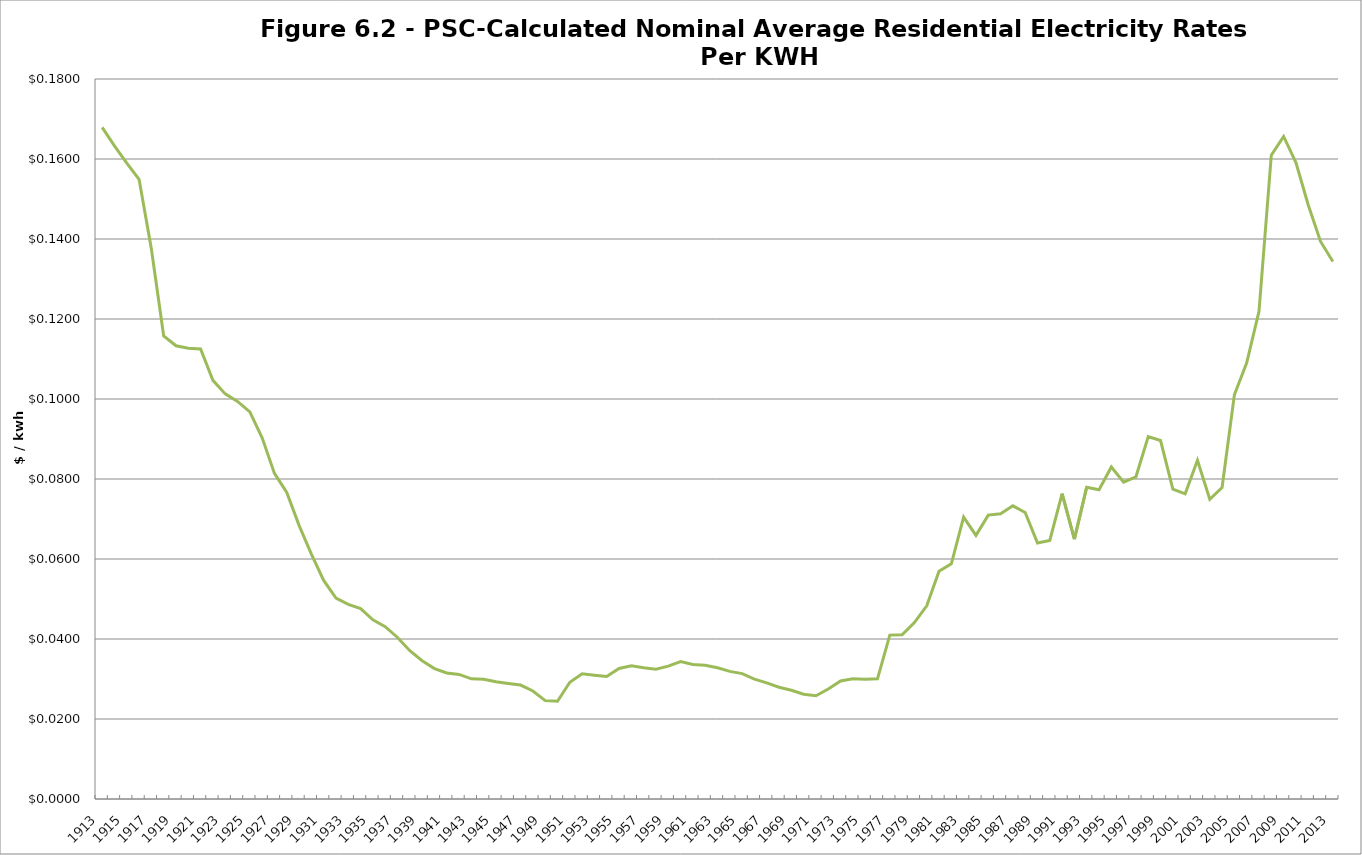
| Category |  Nominal Rates per kwh |
|---|---|
| 1913.0 | 0.168 |
| 1914.0 | 0.163 |
| 1915.0 | 0.159 |
| 1916.0 | 0.155 |
| 1917.0 | 0.138 |
| 1918.0 | 0.116 |
| 1919.0 | 0.113 |
| 1920.0 | 0.113 |
| 1921.0 | 0.112 |
| 1922.0 | 0.105 |
| 1923.0 | 0.101 |
| 1924.0 | 0.099 |
| 1925.0 | 0.097 |
| 1926.0 | 0.09 |
| 1927.0 | 0.081 |
| 1928.0 | 0.077 |
| 1929.0 | 0.068 |
| 1930.0 | 0.061 |
| 1931.0 | 0.055 |
| 1932.0 | 0.05 |
| 1933.0 | 0.049 |
| 1934.0 | 0.048 |
| 1935.0 | 0.045 |
| 1936.0 | 0.043 |
| 1937.0 | 0.04 |
| 1938.0 | 0.037 |
| 1939.0 | 0.035 |
| 1940.0 | 0.033 |
| 1941.0 | 0.032 |
| 1942.0 | 0.031 |
| 1943.0 | 0.03 |
| 1944.0 | 0.03 |
| 1945.0 | 0.029 |
| 1946.0 | 0.029 |
| 1947.0 | 0.028 |
| 1948.0 | 0.027 |
| 1949.0 | 0.025 |
| 1950.0 | 0.024 |
| 1951.0 | 0.029 |
| 1952.0 | 0.031 |
| 1953.0 | 0.031 |
| 1954.0 | 0.031 |
| 1955.0 | 0.033 |
| 1956.0 | 0.033 |
| 1957.0 | 0.033 |
| 1958.0 | 0.032 |
| 1959.0 | 0.033 |
| 1960.0 | 0.034 |
| 1961.0 | 0.034 |
| 1962.0 | 0.033 |
| 1963.0 | 0.033 |
| 1964.0 | 0.032 |
| 1965.0 | 0.031 |
| 1966.0 | 0.03 |
| 1967.0 | 0.029 |
| 1968.0 | 0.028 |
| 1969.0 | 0.027 |
| 1970.0 | 0.026 |
| 1971.0 | 0.026 |
| 1972.0 | 0.028 |
| 1973.0 | 0.029 |
| 1974.0 | 0.03 |
| 1975.0 | 0.03 |
| 1976.0 | 0.03 |
| 1977.0 | 0.041 |
| 1978.0 | 0.041 |
| 1979.0 | 0.044 |
| 1980.0 | 0.048 |
| 1981.0 | 0.057 |
| 1982.0 | 0.059 |
| 1983.0 | 0.07 |
| 1984.0 | 0.066 |
| 1985.0 | 0.071 |
| 1986.0 | 0.071 |
| 1987.0 | 0.073 |
| 1988.0 | 0.072 |
| 1989.0 | 0.064 |
| 1990.0 | 0.065 |
| 1991.0 | 0.076 |
| 1992.0 | 0.065 |
| 1993.0 | 0.078 |
| 1994.0 | 0.077 |
| 1995.0 | 0.083 |
| 1996.0 | 0.079 |
| 1997.0 | 0.081 |
| 1998.0 | 0.091 |
| 1999.0 | 0.09 |
| 2000.0 | 0.077 |
| 2001.0 | 0.076 |
| 2002.0 | 0.085 |
| 2003.0 | 0.075 |
| 2004.0 | 0.078 |
| 2005.0 | 0.101 |
| 2006.0 | 0.109 |
| 2007.0 | 0.122 |
| 2008.0 | 0.161 |
| 2009.0 | 0.166 |
| 2010.0 | 0.159 |
| 2011.0 | 0.149 |
| 2012.0 | 0.139 |
| 2013.0 | 0.134 |